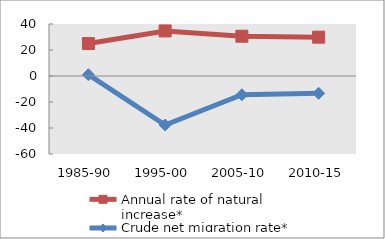
| Category | Annual rate of natural increase* | Crude net migration rate* |
|---|---|---|
| 1985-90 | 24.963 | 1.001 |
| 1995-00 | 34.667 | -37.717 |
| 2005-10 | 30.597 | -14.437 |
| 2010-15 | 29.878 | -13.321 |